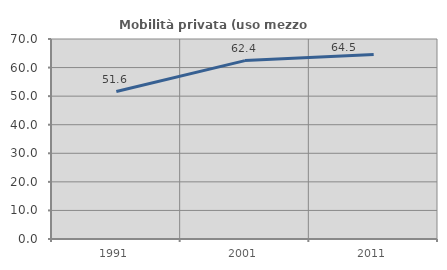
| Category | Mobilità privata (uso mezzo privato) |
|---|---|
| 1991.0 | 51.621 |
| 2001.0 | 62.443 |
| 2011.0 | 64.546 |